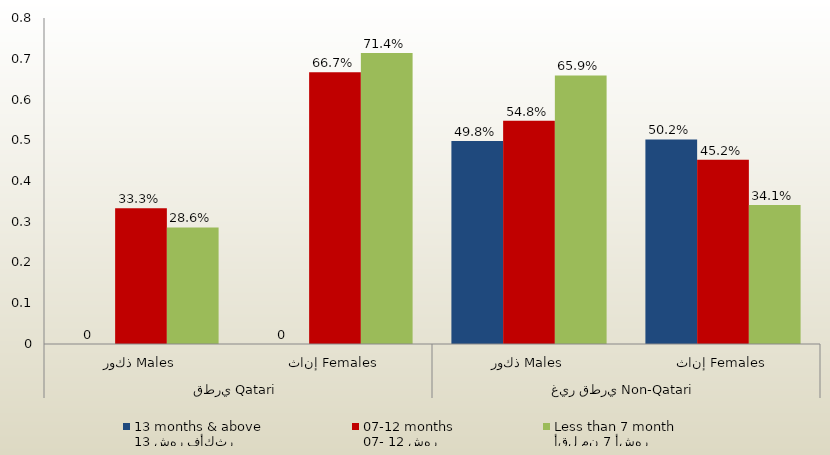
| Category | 13 شهر فأكثر
13 months & above | 07- 12 شهر
07-12 months | أقل من 7 أشهر
Less than 7 month  |
|---|---|---|---|
| 0 | 0 | 0.333 | 0.286 |
| 1 | 0 | 0.667 | 0.714 |
| 2 | 0.498 | 0.548 | 0.659 |
| 3 | 0.502 | 0.452 | 0.341 |